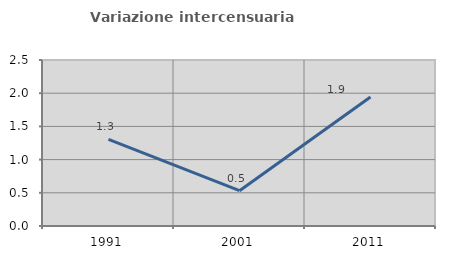
| Category | Variazione intercensuaria annua |
|---|---|
| 1991.0 | 1.304 |
| 2001.0 | 0.532 |
| 2011.0 | 1.943 |